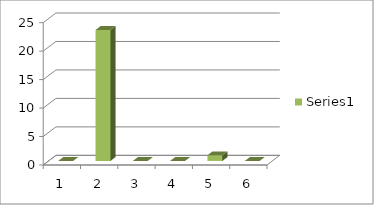
| Category | Series 0 |
|---|---|
| 0 | 0 |
| 1 | 23 |
| 2 | 0 |
| 3 | 0 |
| 4 | 1 |
| 5 | 0 |